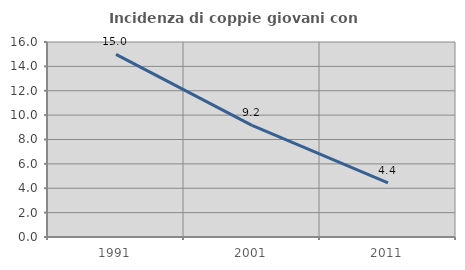
| Category | Incidenza di coppie giovani con figli |
|---|---|
| 1991.0 | 14.984 |
| 2001.0 | 9.163 |
| 2011.0 | 4.443 |